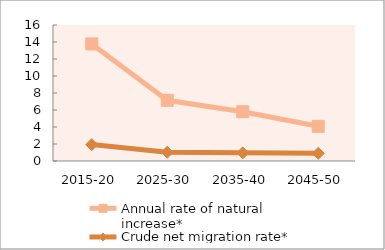
| Category | Annual rate of natural increase* | Crude net migration rate* |
|---|---|---|
| 2015-20 | 13.774 | 1.928 |
| 2025-30 | 7.144 | 1.031 |
| 2035-40 | 5.799 | 0.959 |
| 2045-50 | 4.079 | 0.902 |